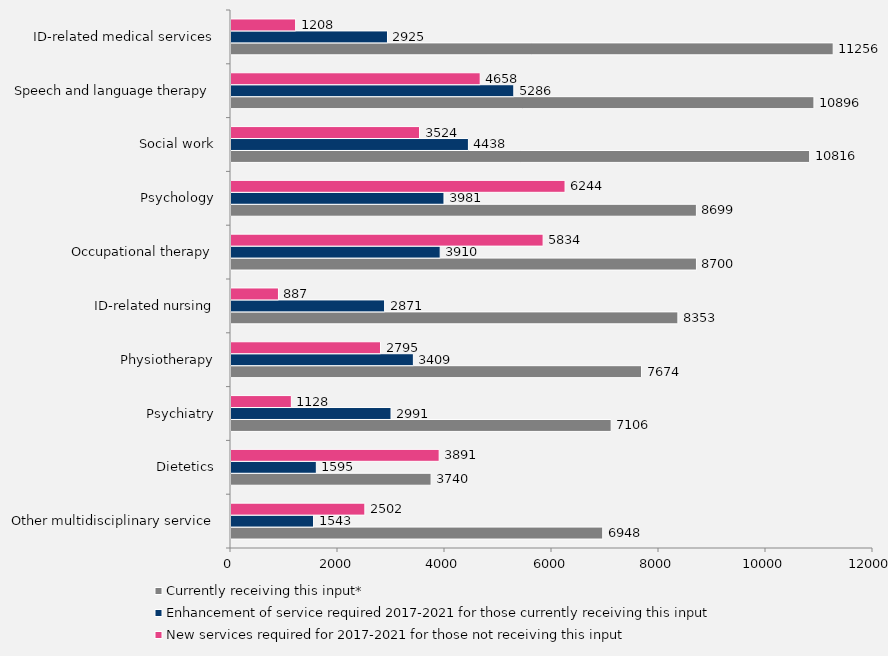
| Category | Currently receiving this input*  | Enhancement of service required 2017-2021 for those currently receiving this input | New services required for 2017-2021 for those not receiving this input |
|---|---|---|---|
| Other multidisciplinary service | 6948 | 1543 | 2502 |
| Dietetics | 3740 | 1595 | 3891 |
| Psychiatry | 7106 | 2991 | 1128 |
| Physiotherapy | 7674 | 3409 | 2795 |
| ID-related nursing | 8353 | 2871 | 887 |
| Occupational therapy | 8700 | 3910 | 5834 |
| Psychology | 8699 | 3981 | 6244 |
| Social work | 10816 | 4438 | 3524 |
| Speech and language therapy | 10896 | 5286 | 4658 |
| ID-related medical services | 11256 | 2925 | 1208 |